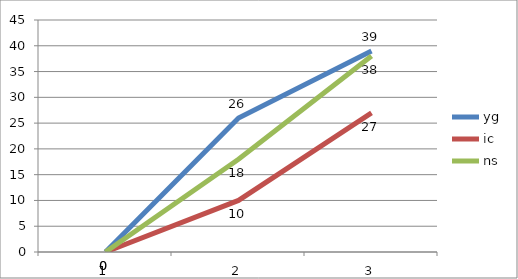
| Category | yg | ic | ns |
|---|---|---|---|
| 0 | 0 | 0 | 0 |
| 1 | 26 | 10 | 18 |
| 2 | 39 | 27 | 38 |